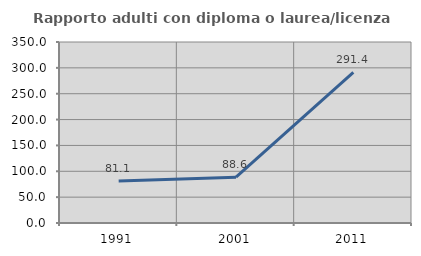
| Category | Rapporto adulti con diploma o laurea/licenza media  |
|---|---|
| 1991.0 | 81.132 |
| 2001.0 | 88.636 |
| 2011.0 | 291.379 |